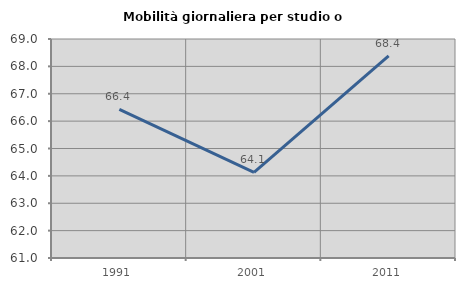
| Category | Mobilità giornaliera per studio o lavoro |
|---|---|
| 1991.0 | 66.428 |
| 2001.0 | 64.126 |
| 2011.0 | 68.388 |